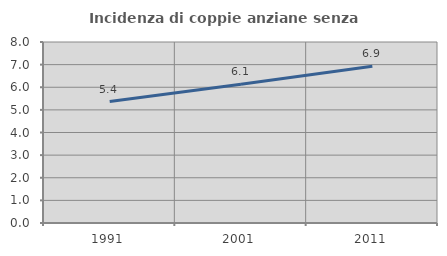
| Category | Incidenza di coppie anziane senza figli  |
|---|---|
| 1991.0 | 5.366 |
| 2001.0 | 6.128 |
| 2011.0 | 6.925 |